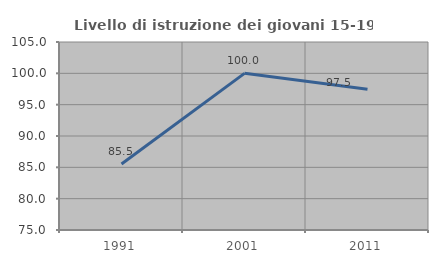
| Category | Livello di istruzione dei giovani 15-19 anni |
|---|---|
| 1991.0 | 85.526 |
| 2001.0 | 100 |
| 2011.0 | 97.468 |